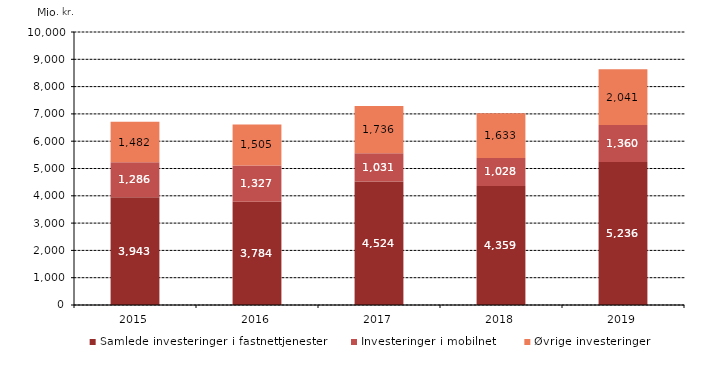
| Category | Samlede investeringer i fastnettjenester | Investeringer i mobilnet | Øvrige investeringer |
|---|---|---|---|
| 2015.0 | 3942.948 | 1286.307 | 1482.137 |
| 2016.0 | 3783.652 | 1326.949 | 1504.618 |
| 2017.0 | 4524.283 | 1030.872 | 1735.837 |
| 2018.0 | 4359.08 | 1028.402 | 1632.552 |
| 2019.0 | 5236.113 | 1360.142 | 2041.411 |